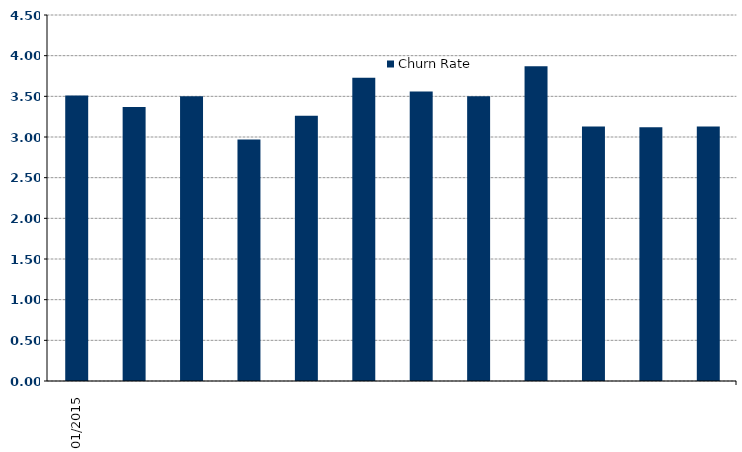
| Category | Churn Rate |
|---|---|
| 2013-01-01 | 0 |
| 2013-02-01 | 0 |